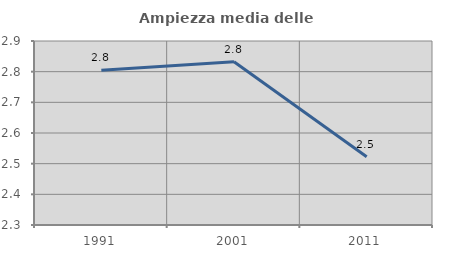
| Category | Ampiezza media delle famiglie |
|---|---|
| 1991.0 | 2.805 |
| 2001.0 | 2.833 |
| 2011.0 | 2.523 |